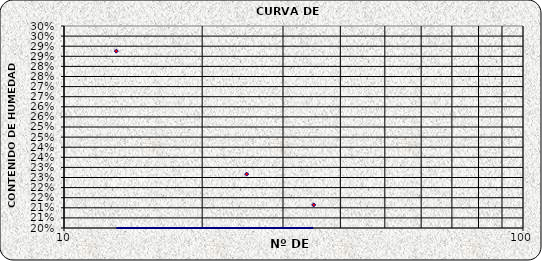
| Category | Series 0 |
|---|---|
| 35.0 | 0.211 |
| 25.0 | 0.227 |
| 13.0 | 0.288 |